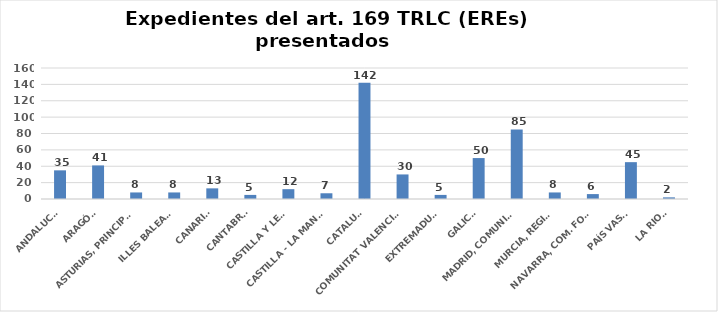
| Category | Series 0 |
|---|---|
| ANDALUCÍA | 35 |
| ARAGÓN | 41 |
| ASTURIAS, PRINCIPADO | 8 |
| ILLES BALEARS | 8 |
| CANARIAS | 13 |
| CANTABRIA | 5 |
| CASTILLA Y LEÓN | 12 |
| CASTILLA - LA MANCHA | 7 |
| CATALUÑA | 142 |
| COMUNITAT VALENCIANA | 30 |
| EXTREMADURA | 5 |
| GALICIA | 50 |
| MADRID, COMUNIDAD | 85 |
| MURCIA, REGIÓN | 8 |
| NAVARRA, COM. FORAL | 6 |
| PAÍS VASCO | 45 |
| LA RIOJA | 2 |